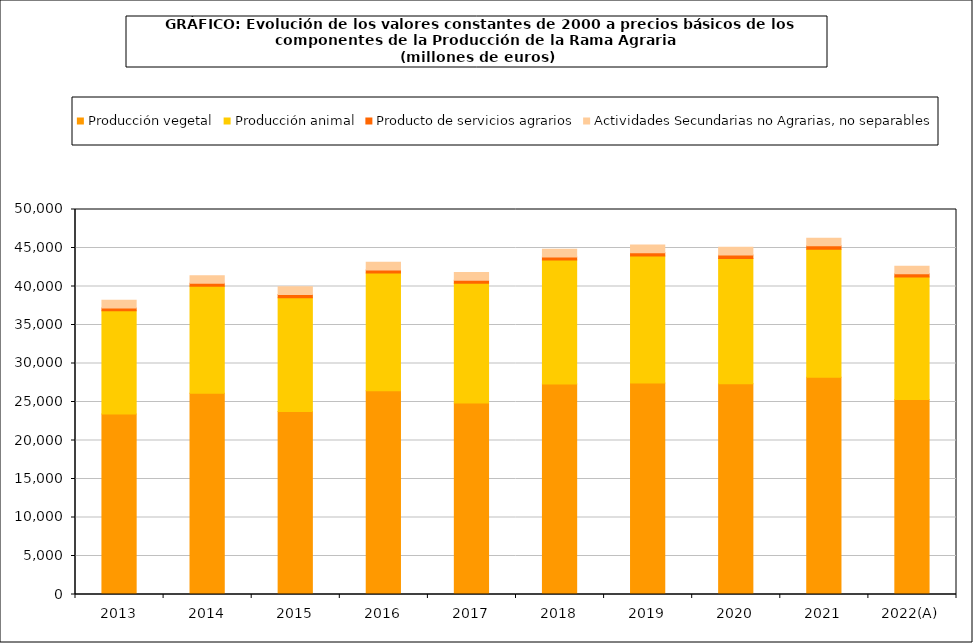
| Category | Producción vegetal | Producción animal | Producto de servicios agrarios | Actividades Secundarias no Agrarias, no separables |
|---|---|---|---|---|
| 2013 | 23433.2 | 13422.8 | 352 | 1014.7 |
| 2014 | 26123.1 | 13909.9 | 384 | 991.6 |
| 2015 | 23758.8 | 14795.1 | 402.1 | 1014.9 |
| 2016 | 26460.2 | 15288.9 | 399.1 | 1013.9 |
| 2017 | 24873.4 | 15534.7 | 394.7 | 1013.8 |
| 2018 | 27338.2 | 16092.6 | 400.1 | 1020.9 |
| 2019 | 27454.1 | 16512.9 | 409.8 | 1015.5 |
| 2020 | 27383 | 16264.5 | 453 | 1000.2 |
| 2021 | 28215.3 | 16609.7 | 457.8 | 977.6 |
| 2022(A) | 25333.5 | 15901.4 | 405 | 977.8 |